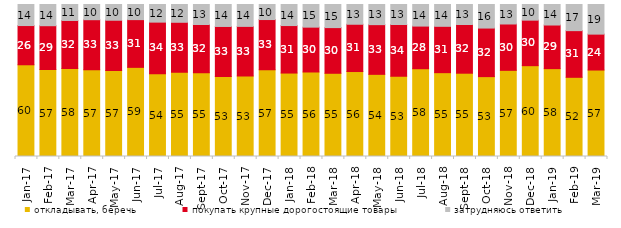
| Category | откладывать, беречь | покупать крупные дорогостоящие товары | затрудняюсь ответить |
|---|---|---|---|
| 2017-01-01 | 60.35 | 25.8 | 13.85 |
| 2017-02-01 | 56.8 | 28.6 | 13.85 |
| 2017-03-01 | 57.9 | 31.6 | 10.5 |
| 2017-04-01 | 57.1 | 32.85 | 10 |
| 2017-05-01 | 56.6 | 33.05 | 10.35 |
| 2017-06-01 | 58.65 | 31.4 | 9.95 |
| 2017-07-01 | 54.4 | 34 | 11.6 |
| 2017-08-01 | 55.4 | 32.9 | 11.7 |
| 2017-09-01 | 55.1 | 31.75 | 13.15 |
| 2017-10-01 | 52.6 | 32.95 | 14.45 |
| 2017-11-01 | 52.9 | 32.7 | 14.4 |
| 2017-12-01 | 57.1 | 33 | 9.9 |
| 2018-01-01 | 54.9 | 31.25 | 13.85 |
| 2018-02-01 | 55.6 | 29.5 | 14.9 |
| 2018-03-01 | 54.75 | 30.05 | 15.2 |
| 2018-04-01 | 55.9 | 31.1 | 13 |
| 2018-05-01 | 54.05 | 32.7 | 13.25 |
| 2018-06-01 | 52.85 | 34 | 13.15 |
| 2018-07-01 | 57.75 | 28.05 | 14.2 |
| 2018-08-01 | 55.15 | 30.5 | 14.35 |
| 2018-09-01 | 54.8 | 32.05 | 13.15 |
| 2018-10-01 | 52.55 | 31.95 | 15.5 |
| 2018-11-01 | 56.687 | 30.489 | 12.824 |
| 2018-12-01 | 59.75 | 29.95 | 10.3 |
| 2019-01-01 | 57.8 | 28.7 | 13.5 |
| 2019-02-01 | 52.1 | 30.7 | 17.2 |
| 2019-03-01 | 56.887 | 23.62 | 19.493 |